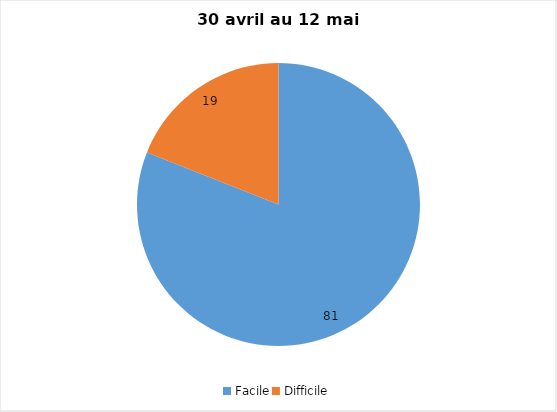
| Category | Series 0 |
|---|---|
| Facile | 81 |
| Difficile | 19 |